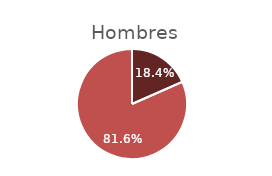
| Category | Hombre |
|---|---|
| 0 | 0.184 |
| 1 | 0.816 |